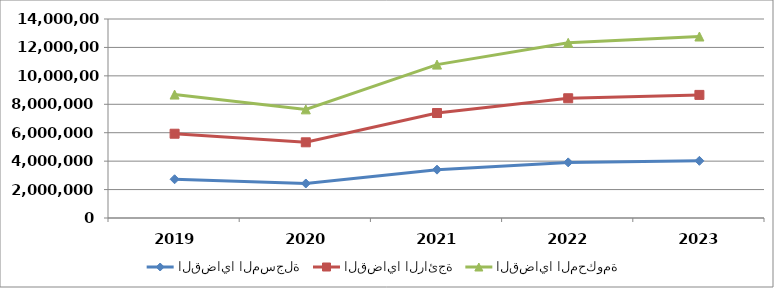
| Category | القضايا المسجلة | القضايا الرائجة | القضايا المحكومة |
|---|---|---|---|
| 2019.0 | 2725834 | 3203085 | 2754326 |
| 2020.0 | 2427489 | 2897920 | 2316741 |
| 2021.0 | 3402023 | 3983264 | 3406846 |
| 2022.0 | 3912481 | 4511660 | 3899835 |
| 2023.0 | 4021572 | 4639374 | 4107659 |